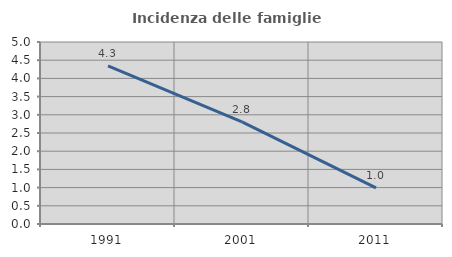
| Category | Incidenza delle famiglie numerose |
|---|---|
| 1991.0 | 4.342 |
| 2001.0 | 2.805 |
| 2011.0 | 0.991 |